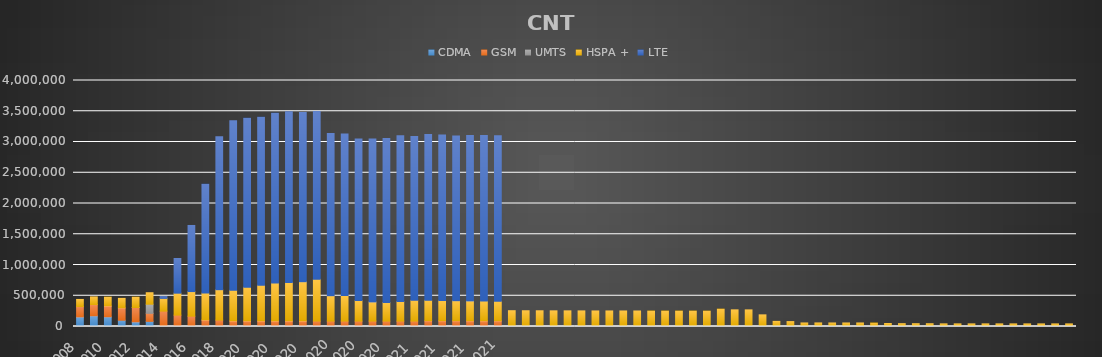
| Category | CDMA | GSM | UMTS | HSPA + | LTE |
|---|---|---|---|---|---|
| 2008 | 155151 | 168816 | 0 | 116162 | 0 |
| 2009 | 173602 | 183298 | 0 | 124298 | 0 |
| 2010 | 157438 | 176292 | 0 | 143876 | 0 |
| 2011 | 102115 | 201253 | 0 | 154224 | 0 |
| 2012 | 75179 | 233874 | 218 | 167677 | 0 |
| 2013 | 83748 | 130396 | 148416 | 186769 | 0 |
| 2014 | 3009 | 246983 | 0 | 207662 | 28176 |
| 2015 | 0 | 185171 | 0 | 356720 | 564105 |
| 2016 | 0 | 167794 | 0 | 399614 | 1075501 |
| 2017 | 0 | 105840 | 0 | 438789 | 1770311 |
| 2018 | 0 | 104907 | 0 | 491699 | 2488002 |
| 2019 | 0 | 90785 | 0 | 498724 | 2755329 |
| Ene 2020 | 0 | 90653 | 0 | 548441 | 2747561 |
| Feb 2020 | 0 | 90809 | 0 | 581320 | 2731301 |
| Mar 2020 | 0 | 90524 | 0 | 615250 | 2761936 |
| Abr 2020 | 0 | 90504 | 0 | 626708 | 2773110 |
| May 2020 | 0 | 90059 | 0 | 638789 | 2751627 |
| Jun 2020 | 0 | 88685 | 0 | 678424 | 2728671 |
| Jul 2020 | 0 | 88220 | 0 | 411989 | 2638039 |
| Ago 2020 | 0 | 88198 | 0 | 413897 | 2629506 |
| Sep 2020 | 0 | 88301 | 0 | 332718 | 2629244 |
| Oct 2020 | 0 | 88272 | 0 | 311560 | 2649390 |
| Nov 2020 | 0 | 88264 | 0 | 302529 | 2666120 |
| Dic 2020 | 0 | 88328 | 0 | 316427 | 2695427 |
| Ene 2021 | 0 | 88262 | 0 | 336631 | 2666120 |
| Feb 2021 | 0 | 93850 | 0 | 333461 | 2695261 |
| Mar 2021 | 0 | 93688 | 0 | 329835 | 2691027 |
| Abr 2021 | 0 | 93521 | 0 | 326352 | 2679011 |
| May 2021 | 0 | 92587 | 0 | 322759 | 2690525 |
| Jun 2021 | 0 | 92587 | 0 | 321040 | 2690525 |
| Jul 2021 | 0 | 92587 | 0 | 318229 | 2690525 |